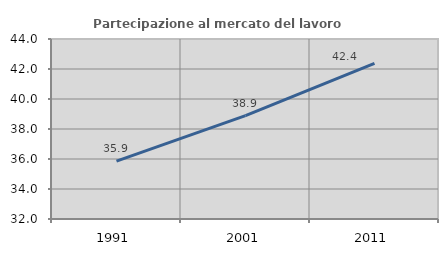
| Category | Partecipazione al mercato del lavoro  femminile |
|---|---|
| 1991.0 | 35.853 |
| 2001.0 | 38.891 |
| 2011.0 | 42.374 |